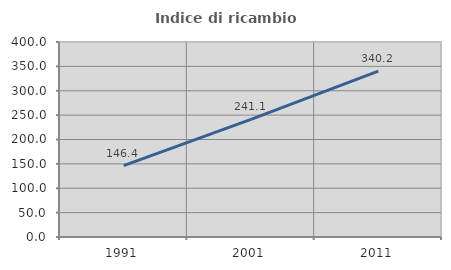
| Category | Indice di ricambio occupazionale  |
|---|---|
| 1991.0 | 146.388 |
| 2001.0 | 241.111 |
| 2011.0 | 340.194 |